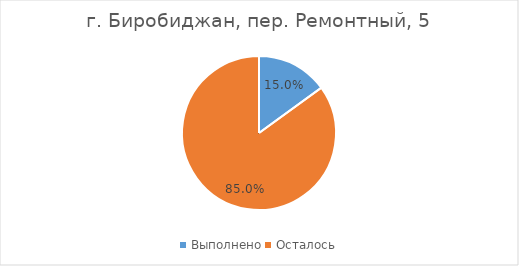
| Category | г. Биробиджан, пер. Ремонтный, 5 |
|---|---|
| Выполнено | 0.15 |
| Осталось | 0.85 |